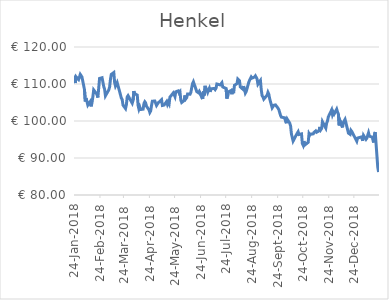
| Category | Series 0 |
|---|---|
| 2019-01-22 | 86.22 |
| 2019-01-21 | 87.56 |
| 2019-01-18 | 97.02 |
| 2019-01-17 | 96.16 |
| 2019-01-16 | 94.2 |
| 2019-01-15 | 95.58 |
| 2019-01-14 | 95.56 |
| 2019-01-11 | 95.9 |
| 2019-01-10 | 96.82 |
| 2019-01-09 | 96.74 |
| 2019-01-08 | 95.36 |
| 2019-01-07 | 95.04 |
| 2019-01-04 | 96.12 |
| 2019-01-03 | 94.62 |
| 2019-01-02 | 95.72 |
| 2018-12-28 | 95.4 |
| 2018-12-27 | 94.54 |
| 2018-12-21 | 97.18 |
| 2018-12-20 | 97.48 |
| 2018-12-19 | 96.4 |
| 2018-12-18 | 96.66 |
| 2018-12-17 | 96.72 |
| 2018-12-14 | 99.56 |
| 2018-12-13 | 100.45 |
| 2018-12-12 | 100.65 |
| 2018-12-11 | 99.64 |
| 2018-12-10 | 98.26 |
| 2018-12-07 | 100.1 |
| 2018-12-06 | 98.8 |
| 2018-12-05 | 101.9 |
| 2018-12-04 | 102.45 |
| 2018-12-03 | 103.2 |
| 2018-11-30 | 101.9 |
| 2018-11-29 | 102.35 |
| 2018-11-28 | 101.75 |
| 2018-11-27 | 103 |
| 2018-11-26 | 102.8 |
| 2018-11-23 | 101.1 |
| 2018-11-22 | 99.98 |
| 2018-11-21 | 99.4 |
| 2018-11-20 | 98.08 |
| 2018-11-19 | 98.06 |
| 2018-11-16 | 99.82 |
| 2018-11-15 | 97.96 |
| 2018-11-14 | 97.62 |
| 2018-11-13 | 98.38 |
| 2018-11-12 | 97.34 |
| 2018-11-09 | 96.96 |
| 2018-11-08 | 97.32 |
| 2018-11-07 | 97.06 |
| 2018-11-06 | 96.94 |
| 2018-11-05 | 96.52 |
| 2018-11-02 | 96.48 |
| 2018-11-01 | 96.18 |
| 2018-10-31 | 96.58 |
| 2018-10-30 | 94.24 |
| 2018-10-29 | 94.34 |
| 2018-10-26 | 93.52 |
| 2018-10-25 | 94.6 |
| 2018-10-24 | 93.46 |
| 2018-10-23 | 93.96 |
| 2018-10-22 | 96.52 |
| 2018-10-19 | 96.34 |
| 2018-10-18 | 97.1 |
| 2018-10-17 | 96.72 |
| 2018-10-16 | 96.92 |
| 2018-10-15 | 95.9 |
| 2018-10-12 | 94.58 |
| 2018-10-11 | 94.62 |
| 2018-10-10 | 96.48 |
| 2018-10-09 | 98.66 |
| 2018-10-08 | 99.4 |
| 2018-10-05 | 100.5 |
| 2018-10-04 | 99.4 |
| 2018-10-02 | 100.85 |
| 2018-10-01 | 101 |
| 2018-09-28 | 101.05 |
| 2018-09-27 | 101.5 |
| 2018-09-26 | 101.75 |
| 2018-09-25 | 103.05 |
| 2018-09-24 | 103.45 |
| 2018-09-21 | 104.35 |
| 2018-09-20 | 104.15 |
| 2018-09-19 | 104.25 |
| 2018-09-18 | 104.05 |
| 2018-09-17 | 103.55 |
| 2018-09-14 | 106.05 |
| 2018-09-13 | 107.25 |
| 2018-09-12 | 107.75 |
| 2018-09-11 | 107 |
| 2018-09-10 | 107.1 |
| 2018-09-07 | 105.9 |
| 2018-09-06 | 106.5 |
| 2018-09-05 | 106.85 |
| 2018-09-04 | 108.4 |
| 2018-09-03 | 110.95 |
| 2018-08-31 | 109.95 |
| 2018-08-30 | 111.35 |
| 2018-08-29 | 111.55 |
| 2018-08-28 | 112.2 |
| 2018-08-27 | 111.9 |
| 2018-08-24 | 111.6 |
| 2018-08-23 | 111.9 |
| 2018-08-22 | 112.1 |
| 2018-08-21 | 111 |
| 2018-08-20 | 110.4 |
| 2018-08-17 | 107.95 |
| 2018-08-16 | 107.55 |
| 2018-08-15 | 107.5 |
| 2018-08-14 | 109.45 |
| 2018-08-13 | 108.6 |
| 2018-08-10 | 109.2 |
| 2018-08-09 | 110.9 |
| 2018-08-08 | 111.1 |
| 2018-08-07 | 111.35 |
| 2018-08-06 | 110.1 |
| 2018-08-03 | 109.65 |
| 2018-08-02 | 107.5 |
| 2018-08-01 | 108.7 |
| 2018-07-31 | 107.25 |
| 2018-07-30 | 108.25 |
| 2018-07-27 | 107.9 |
| 2018-07-26 | 106.7 |
| 2018-07-25 | 106.05 |
| 2018-07-24 | 108.8 |
| 2018-07-23 | 108.55 |
| 2018-07-20 | 109.2 |
| 2018-07-19 | 110.35 |
| 2018-07-18 | 110.05 |
| 2018-07-17 | 109.75 |
| 2018-07-16 | 109.5 |
| 2018-07-13 | 110 |
| 2018-07-12 | 108.85 |
| 2018-07-11 | 108.5 |
| 2018-07-10 | 108.8 |
| 2018-07-09 | 108.55 |
| 2018-07-06 | 108.7 |
| 2018-07-05 | 107.85 |
| 2018-07-04 | 108.85 |
| 2018-07-03 | 108.4 |
| 2018-07-02 | 107.75 |
| 2018-06-29 | 109.5 |
| 2018-06-28 | 106.9 |
| 2018-06-27 | 108.05 |
| 2018-06-26 | 105.95 |
| 2018-06-25 | 106.05 |
| 2018-06-22 | 108 |
| 2018-06-21 | 107.65 |
| 2018-06-20 | 107.9 |
| 2018-06-19 | 107.95 |
| 2018-06-18 | 108.15 |
| 2018-06-15 | 110.6 |
| 2018-06-14 | 110.1 |
| 2018-06-13 | 109 |
| 2018-06-12 | 107.75 |
| 2018-06-11 | 107.25 |
| 2018-06-08 | 107.3 |
| 2018-06-07 | 106.3 |
| 2018-06-06 | 106 |
| 2018-06-05 | 106.9 |
| 2018-06-04 | 105.55 |
| 2018-06-01 | 105 |
| 2018-05-31 | 105.65 |
| 2018-05-30 | 107.85 |
| 2018-05-29 | 107.55 |
| 2018-05-28 | 108.15 |
| 2018-05-25 | 107.9 |
| 2018-05-24 | 106.6 |
| 2018-05-23 | 107.15 |
| 2018-05-22 | 107.6 |
| 2018-05-18 | 106.45 |
| 2018-05-17 | 104.6 |
| 2018-05-16 | 105.05 |
| 2018-05-15 | 104.5 |
| 2018-05-14 | 105.25 |
| 2018-05-11 | 104.3 |
| 2018-05-10 | 104.35 |
| 2018-05-09 | 104.2 |
| 2018-05-08 | 105.75 |
| 2018-05-07 | 105.6 |
| 2018-05-04 | 104.9 |
| 2018-05-03 | 104.7 |
| 2018-05-02 | 104.2 |
| 2018-04-30 | 105.4 |
| 2018-04-27 | 105.35 |
| 2018-04-26 | 104.15 |
| 2018-04-25 | 102.7 |
| 2018-04-24 | 102.3 |
| 2018-04-23 | 103 |
| 2018-04-20 | 104 |
| 2018-04-19 | 104.9 |
| 2018-04-18 | 105.2 |
| 2018-04-17 | 104.75 |
| 2018-04-16 | 103.2 |
| 2018-04-13 | 103.1 |
| 2018-04-12 | 103.8 |
| 2018-04-11 | 103.2 |
| 2018-04-10 | 104.2 |
| 2018-04-09 | 107 |
| 2018-04-06 | 107.4 |
| 2018-04-05 | 108.1 |
| 2018-04-04 | 105.6 |
| 2018-04-03 | 104.8 |
| 2018-03-29 | 106.85 |
| 2018-03-28 | 106.5 |
| 2018-03-27 | 104.4 |
| 2018-03-26 | 103.35 |
| 2018-03-23 | 104.3 |
| 2018-03-22 | 105.8 |
| 2018-03-21 | 106.2 |
| 2018-03-20 | 106.4 |
| 2018-03-19 | 107.9 |
| 2018-03-16 | 110.4 |
| 2018-03-15 | 110.55 |
| 2018-03-14 | 109.45 |
| 2018-03-13 | 110.4 |
| 2018-03-12 | 113.1 |
| 2018-03-09 | 112.6 |
| 2018-03-08 | 111.2 |
| 2018-03-07 | 109.2 |
| 2018-03-06 | 108.4 |
| 2018-03-05 | 108.4 |
| 2018-03-02 | 106.8 |
| 2018-03-01 | 108.6 |
| 2018-02-28 | 109.3 |
| 2018-02-27 | 109.05 |
| 2018-02-26 | 111.7 |
| 2018-02-23 | 111.5 |
| 2018-02-22 | 108.9 |
| 2018-02-21 | 106.35 |
| 2018-02-20 | 107.2 |
| 2018-02-19 | 106.95 |
| 2018-02-16 | 108.4 |
| 2018-02-15 | 106.55 |
| 2018-02-14 | 104.95 |
| 2018-02-13 | 103.95 |
| 2018-02-12 | 105.3 |
| 2018-02-09 | 104.3 |
| 2018-02-08 | 104.35 |
| 2018-02-07 | 106.2 |
| 2018-02-06 | 105.3 |
| 2018-02-05 | 108.5 |
| 2018-02-02 | 111.9 |
| 2018-02-01 | 112.15 |
| 2018-01-31 | 112.6 |
| 2018-01-30 | 111.9 |
| 2018-01-29 | 111.2 |
| 2018-01-26 | 111.95 |
| 2018-01-25 | 110.25 |
| 2018-01-24 | 112.25 |